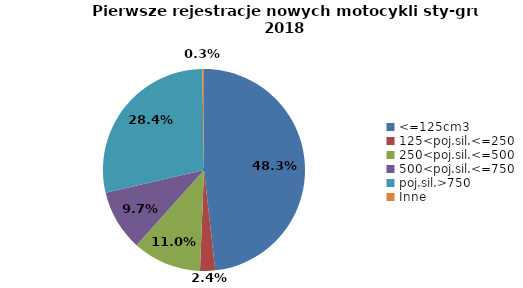
| Category | Series 0 |
|---|---|
| 0 | 7004 |
| 1 | 350 |
| 2 | 1599 |
| 3 | 1412 |
| 4 | 4120 |
| 5 | 39 |